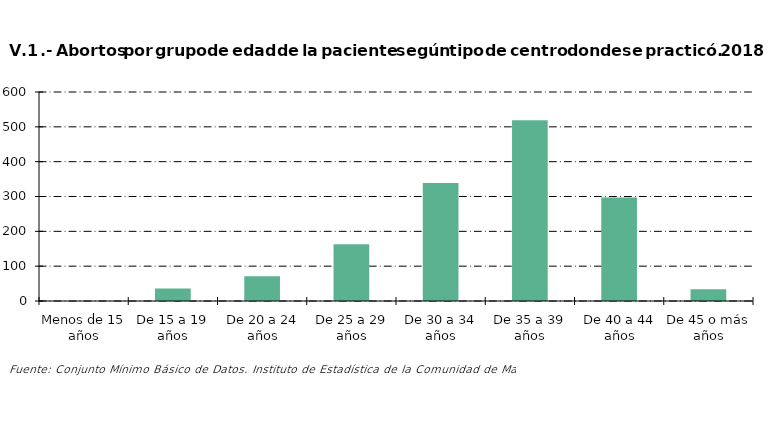
| Category | Series 0 |
|---|---|
| Menos de 15 años | 0 |
| De 15 a 19 años | 36 |
| De 20 a 24 años | 71 |
| De 25 a 29 años | 163 |
| De 30 a 34 años | 339 |
| De 35 a 39 años | 519 |
| De 40 a 44 años | 297 |
| De 45 o más años | 34 |